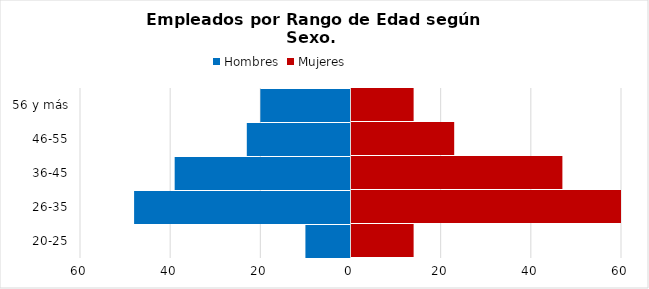
| Category | Hombres | Mujeres |
|---|---|---|
| 20-25 | -10 | 14 |
| 26-35 | -48 | 78 |
| 36-45 | -39 | 47 |
| 46-55 | -23 | 23 |
| 56 y más | -20 | 14 |